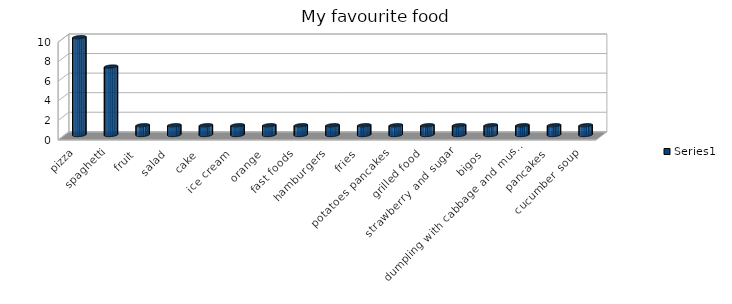
| Category | Series 0 |
|---|---|
| pizza | 10 |
| spaghetti | 7 |
| fruit | 1 |
| salad | 1 |
| cake | 1 |
| ice cream | 1 |
| orange | 1 |
| fast foods | 1 |
| hamburgers | 1 |
| fries | 1 |
| potatoes pancakes | 1 |
| grilled food | 1 |
| strawberry and sugar | 1 |
| bigos | 1 |
| dumpling with cabbage and mushrooms | 1 |
| pancakes | 1 |
| cucumber soup | 1 |